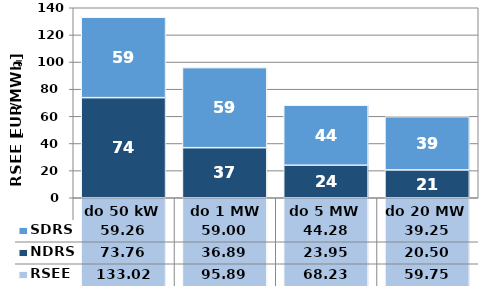
| Category | NDRS | SDRS |
|---|---|---|
| do 50 kW | 73.76 | 59.26 |
|  do 1 MW | 36.89 | 59 |
| do 5 MW | 23.95 | 44.28 |
| do 20 MW | 20.5 | 39.25 |